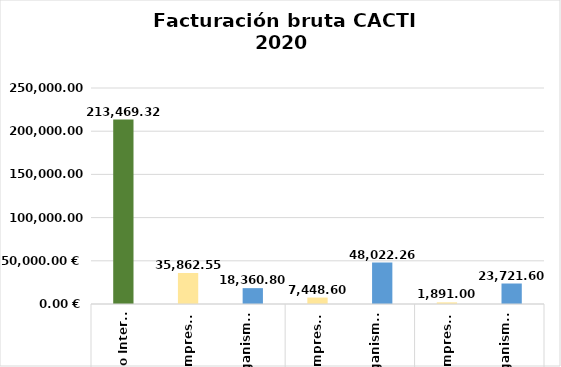
| Category | Series 0 |
|---|---|
| 0 | 213469.321 |
| 1 | 35862.545 |
| 2 | 18360.802 |
| 3 | 7448.603 |
| 4 | 48022.264 |
| 5 | 1891 |
| 6 | 23721.6 |